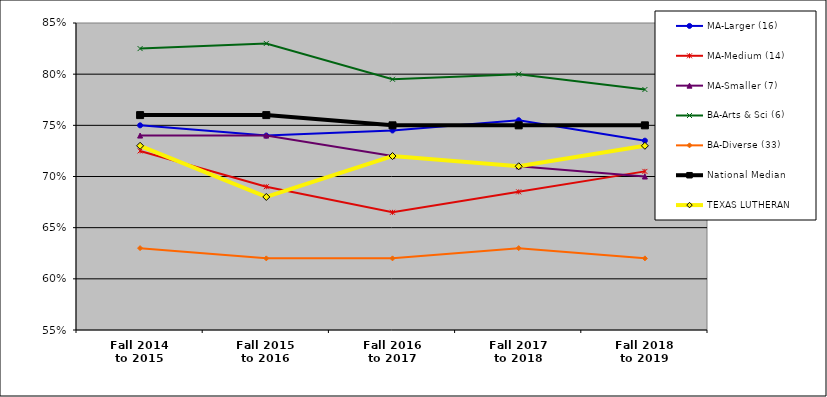
| Category | MA-Larger (16) | MA-Medium (14) | MA-Smaller (7) | BA-Arts & Sci (6) | BA-Diverse (33) | National Median | TEXAS LUTHERAN |
|---|---|---|---|---|---|---|---|
| Fall 2014
to 2015 | 0.75 | 0.725 | 0.74 | 0.825 | 0.63 | 0.76 | 0.73 |
| Fall 2015
to 2016 | 0.74 | 0.69 | 0.74 | 0.83 | 0.62 | 0.76 | 0.68 |
| Fall 2016
to 2017 | 0.745 | 0.665 | 0.72 | 0.795 | 0.62 | 0.75 | 0.72 |
| Fall 2017
to 2018 | 0.755 | 0.685 | 0.71 | 0.8 | 0.63 | 0.75 | 0.71 |
| Fall 2018
to 2019 | 0.735 | 0.705 | 0.7 | 0.785 | 0.62 | 0.75 | 0.73 |